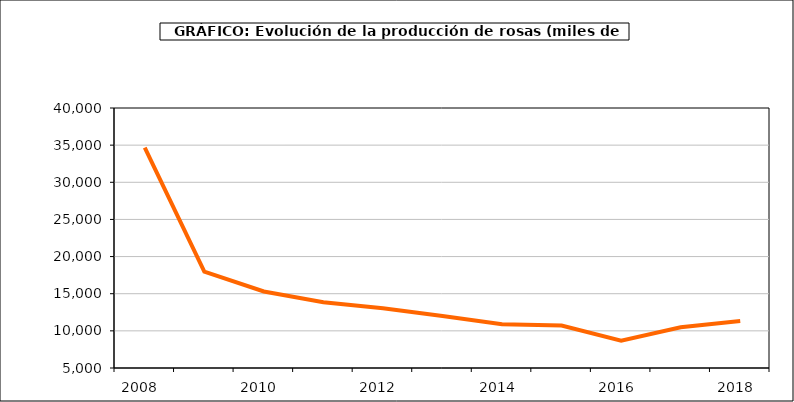
| Category | producción |
|---|---|
| 2008.0 | 34657 |
| 2009.0 | 17983 |
| 2010.0 | 15301 |
| 2011.0 | 13840 |
| 2012.0 | 13038 |
| 2013.0 | 11993 |
| 2014.0 | 10897 |
| 2015.0 | 10725 |
| 2016.0 | 8682 |
| 2017.0 | 10480 |
| 2018.0 | 11340 |